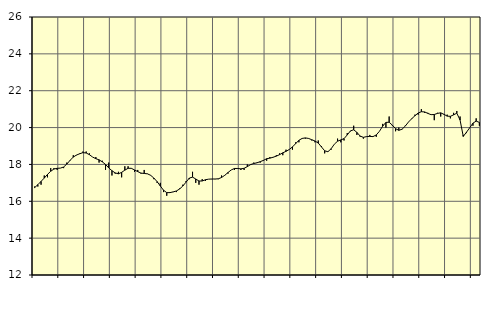
| Category | Piggar | Vård och omsorg, SNI 86-881 |
|---|---|---|
| nan | 16.8 | 16.74 |
| 87.0 | 16.8 | 16.9 |
| 87.0 | 16.9 | 17.08 |
| 87.0 | 17.4 | 17.26 |
| nan | 17.3 | 17.46 |
| 88.0 | 17.8 | 17.63 |
| 88.0 | 17.8 | 17.75 |
| 88.0 | 17.7 | 17.79 |
| nan | 17.8 | 17.8 |
| 89.0 | 17.8 | 17.86 |
| 89.0 | 18.1 | 18.02 |
| 89.0 | 18.2 | 18.22 |
| nan | 18.5 | 18.4 |
| 90.0 | 18.5 | 18.51 |
| 90.0 | 18.6 | 18.58 |
| 90.0 | 18.7 | 18.64 |
| nan | 18.7 | 18.62 |
| 91.0 | 18.6 | 18.53 |
| 91.0 | 18.4 | 18.4 |
| 91.0 | 18.4 | 18.31 |
| nan | 18.1 | 18.25 |
| 92.0 | 18.2 | 18.14 |
| 92.0 | 17.7 | 18 |
| 92.0 | 18.1 | 17.81 |
| nan | 17.4 | 17.66 |
| 93.0 | 17.5 | 17.54 |
| 93.0 | 17.6 | 17.49 |
| 93.0 | 17.3 | 17.57 |
| nan | 17.9 | 17.69 |
| 94.0 | 17.9 | 17.79 |
| 94.0 | 17.8 | 17.79 |
| 94.0 | 17.6 | 17.7 |
| nan | 17.7 | 17.61 |
| 95.0 | 17.5 | 17.53 |
| 95.0 | 17.7 | 17.51 |
| 95.0 | 17.5 | 17.49 |
| nan | 17.4 | 17.41 |
| 96.0 | 17.2 | 17.26 |
| 96.0 | 17 | 17.07 |
| 96.0 | 17 | 16.83 |
| nan | 16.5 | 16.6 |
| 97.0 | 16.3 | 16.47 |
| 97.0 | 16.5 | 16.47 |
| 97.0 | 16.5 | 16.51 |
| nan | 16.5 | 16.56 |
| 98.0 | 16.7 | 16.67 |
| 98.0 | 16.9 | 16.83 |
| 98.0 | 17.1 | 17.04 |
| nan | 17.2 | 17.26 |
| 99.0 | 17.6 | 17.31 |
| 99.0 | 17 | 17.21 |
| 99.0 | 16.9 | 17.1 |
| nan | 17.2 | 17.1 |
| 0.0 | 17.1 | 17.17 |
| 0.0 | 17.2 | 17.2 |
| 0.0 | 17.2 | 17.21 |
| nan | 17.2 | 17.21 |
| 1.0 | 17.2 | 17.22 |
| 1.0 | 17.4 | 17.29 |
| 1.0 | 17.4 | 17.41 |
| nan | 17.5 | 17.56 |
| 2.0 | 17.7 | 17.7 |
| 2.0 | 17.7 | 17.78 |
| 2.0 | 17.8 | 17.78 |
| nan | 17.7 | 17.76 |
| 3.0 | 17.7 | 17.79 |
| 3.0 | 18 | 17.88 |
| 3.0 | 18 | 17.99 |
| nan | 18.1 | 18.05 |
| 4.0 | 18.1 | 18.09 |
| 4.0 | 18.1 | 18.15 |
| 4.0 | 18.2 | 18.22 |
| nan | 18.2 | 18.31 |
| 5.0 | 18.4 | 18.34 |
| 5.0 | 18.4 | 18.39 |
| 5.0 | 18.5 | 18.45 |
| nan | 18.6 | 18.53 |
| 6.0 | 18.5 | 18.63 |
| 6.0 | 18.8 | 18.71 |
| 6.0 | 18.8 | 18.81 |
| nan | 18.8 | 18.95 |
| 7.0 | 19.2 | 19.13 |
| 7.0 | 19.2 | 19.31 |
| 7.0 | 19.4 | 19.41 |
| nan | 19.4 | 19.44 |
| 8.0 | 19.4 | 19.41 |
| 8.0 | 19.3 | 19.34 |
| 8.0 | 19.2 | 19.27 |
| nan | 19.3 | 19.16 |
| 9.0 | 19 | 18.95 |
| 9.0 | 18.6 | 18.74 |
| 9.0 | 18.7 | 18.69 |
| nan | 18.8 | 18.85 |
| 10.0 | 19.1 | 19.1 |
| 10.0 | 19.4 | 19.26 |
| 10.0 | 19.2 | 19.33 |
| nan | 19.3 | 19.4 |
| 11.0 | 19.7 | 19.6 |
| 11.0 | 19.8 | 19.82 |
| 11.0 | 20.1 | 19.88 |
| nan | 19.6 | 19.74 |
| 12.0 | 19.5 | 19.54 |
| 12.0 | 19.4 | 19.47 |
| 12.0 | 19.5 | 19.51 |
| nan | 19.6 | 19.52 |
| 13.0 | 19.5 | 19.51 |
| 13.0 | 19.5 | 19.6 |
| 13.0 | 19.8 | 19.8 |
| nan | 20.2 | 20.08 |
| 14.0 | 20 | 20.28 |
| 14.0 | 20.6 | 20.29 |
| 14.0 | 20.1 | 20.13 |
| nan | 19.8 | 19.94 |
| 15.0 | 20 | 19.85 |
| 15.0 | 19.9 | 19.91 |
| 15.0 | 20.1 | 20.08 |
| nan | 20.3 | 20.3 |
| 16.0 | 20.5 | 20.48 |
| 16.0 | 20.7 | 20.64 |
| 16.0 | 20.7 | 20.79 |
| nan | 21 | 20.86 |
| 17.0 | 20.8 | 20.85 |
| 17.0 | 20.8 | 20.77 |
| 17.0 | 20.7 | 20.7 |
| nan | 20.4 | 20.71 |
| 18.0 | 20.8 | 20.77 |
| 18.0 | 20.6 | 20.8 |
| 18.0 | 20.7 | 20.72 |
| nan | 20.7 | 20.62 |
| 19.0 | 20.5 | 20.61 |
| 19.0 | 20.8 | 20.69 |
| 19.0 | 20.9 | 20.78 |
| nan | 20.6 | 20.41 |
| 20.0 | 19.6 | 19.52 |
| 20.0 | 19.7 | 19.75 |
| 20.0 | 20 | 19.99 |
| nan | 20.1 | 20.24 |
| 21.0 | 20.5 | 20.35 |
| 21.0 | 20.1 | 20.28 |